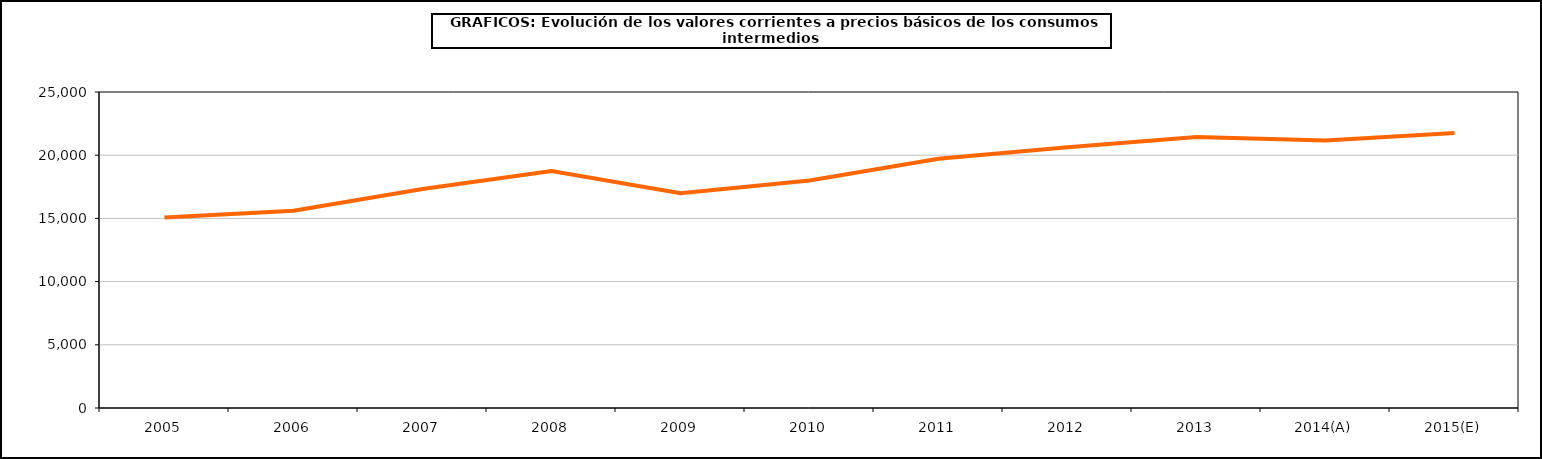
| Category | Total consumos intermedios |
|---|---|
| 2005 | 15062.165 |
| 2006 | 15598.3 |
| 2007 | 17320.3 |
| 2008 | 18741.8 |
| 2009 | 16992.3 |
| 2010 | 18005.1 |
| 2011 | 19714.8 |
| 2012 | 20625.1 |
| 2013 | 21445.2 |
| 2014(A) | 21172.3 |
| 2015(E) | 21754.9 |